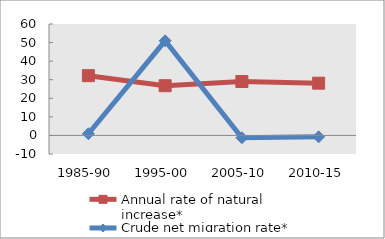
| Category | Annual rate of natural increase* | Crude net migration rate* |
|---|---|---|
| 1985-90 | 32.179 | 0.9 |
| 1995-00 | 26.76 | 50.959 |
| 2005-10 | 29.03 | -1.254 |
| 2010-15 | 28.133 | -0.774 |